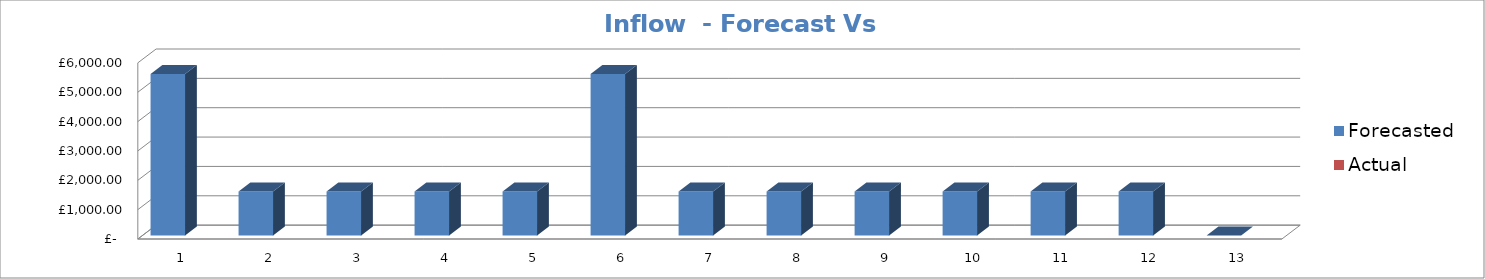
| Category | Forecasted | Actual |
|---|---|---|
| 0 | 5500 |  |
| 1 | 1500 |  |
| 2 | 1500 |  |
| 3 | 1500 |  |
| 4 | 1500 |  |
| 5 | 5500 |  |
| 6 | 1500 |  |
| 7 | 1500 |  |
| 8 | 1500 |  |
| 9 | 1500 |  |
| 10 | 1500 |  |
| 11 | 1500 |  |
| 12 | 0 |  |